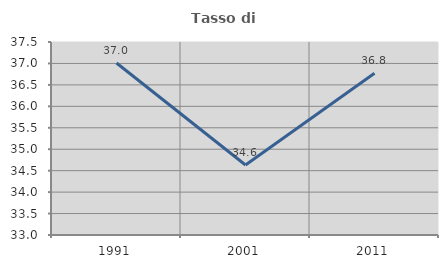
| Category | Tasso di occupazione   |
|---|---|
| 1991.0 | 37.01 |
| 2001.0 | 34.633 |
| 2011.0 | 36.771 |